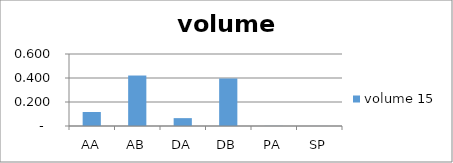
| Category |  volume 15  |
|---|---|
| AA | 0.117 |
| AB | 0.421 |
| DA | 0.066 |
| DB | 0.396 |
| PA | 0.001 |
| SP | 0 |